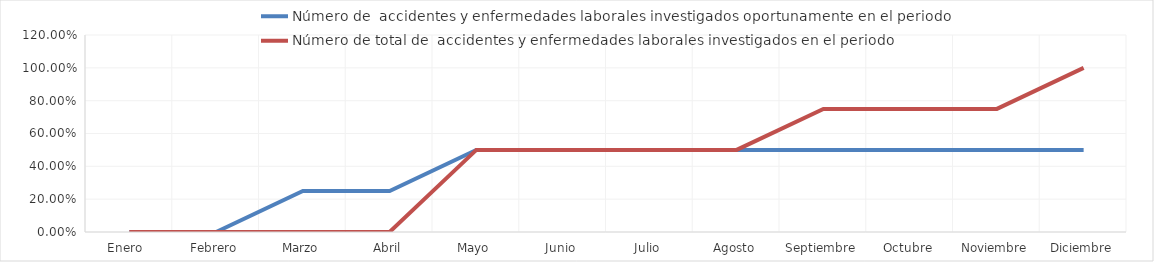
| Category | Número de  accidentes y enfermedades laborales investigados oportunamente en el periodo | Número de total de  accidentes y enfermedades laborales investigados en el periodo |
|---|---|---|
| Enero  | 0 | 0 |
| Febrero | 0 | 0 |
| Marzo | 0.25 | 0 |
| Abril | 0.25 | 0 |
| Mayo | 0.5 | 0.5 |
| Junio | 0.5 | 0.5 |
| Julio | 0.5 | 0.5 |
| Agosto | 0.5 | 0.5 |
| Septiembre | 0.5 | 0.75 |
| Octubre | 0.5 | 0.75 |
| Noviembre | 0.5 | 0.75 |
| Diciembre | 0.5 | 1 |